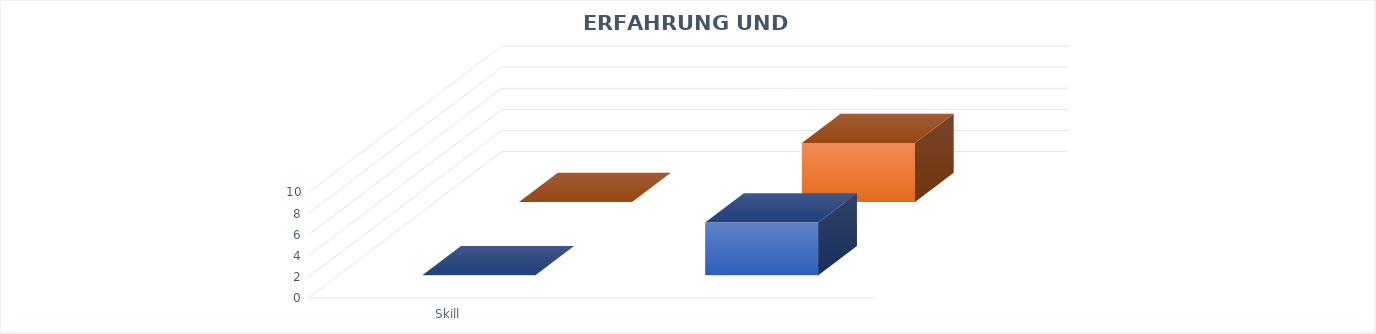
| Category | Bewertungen | Erfahrung |
|---|---|---|
| .NET Core | 5 | 5.583 |
| .NET Framework | 5 | 14.583 |
| ASP.NET | 6 | 14.583 |
| Azure Functions | 4 | 5.333 |
| Azure Search | 4 | 0.917 |
| Azure SQL | 4 | 10.583 |
| Azure Storage | 4 | 7.583 |
| Azure WebJobs | 4 | 7.583 |
| C#.NET | 6 | 14.333 |
| CSS | 6 | 22.75 |
| DI | 4 | 9.25 |
| HTML | 6 | 22.75 |
| JavaScript | 6 | 22.75 |
| jQuery | 5 | 9.417 |
| JSON | 5 | 18.333 |
| LESS | 4 | 7.083 |
| LINQ | 4 | 14.083 |
| MQTT | 4 | 1.833 |
| MVC | 5 | 12.333 |
| OOP | 5 | 14.583 |
| REST | 6 | 7.833 |
| Scrum | 4 | 12.583 |
| SignalR | 4 | 1.5 |
| SOA | 5 | 12.583 |
| SQL | 6 | 18.333 |
| SQL Server | 4 | 14.333 |
| XML | 4 | 20.583 |